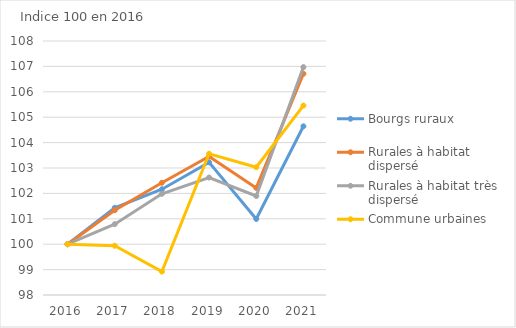
| Category | Bourgs ruraux | Rurales à habitat dispersé | Rurales à habitat très dispersé | Commune urbaines |
|---|---|---|---|---|
| 2016.0 | 100 | 100 | 100 | 100 |
| 2017.0 | 101.432 | 101.338 | 100.788 | 99.939 |
| 2018.0 | 102.163 | 102.419 | 101.983 | 98.922 |
| 2019.0 | 103.223 | 103.453 | 102.625 | 103.562 |
| 2020.0 | 100.994 | 102.217 | 101.897 | 103.031 |
| 2021.0 | 104.642 | 106.71 | 106.972 | 105.458 |